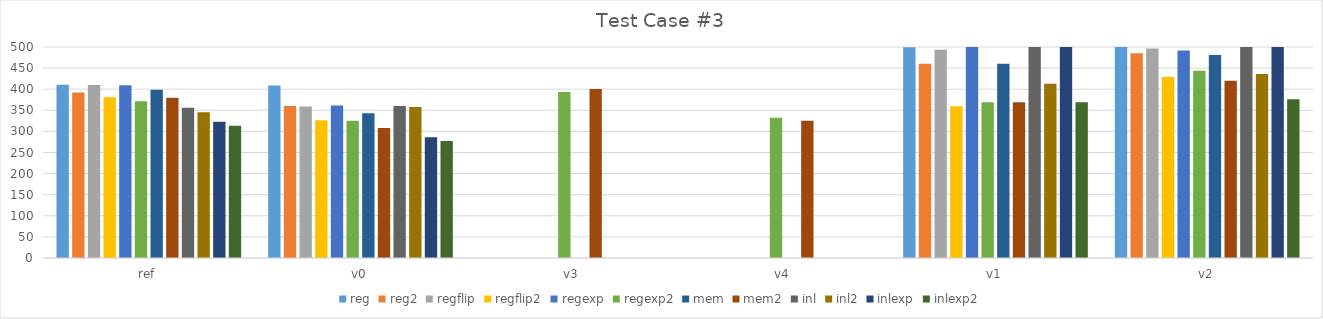
| Category | reg | reg2 | regflip | regflip2 | regexp | regexp2 | mem | mem2 | inl | inl2 | inlexp | inlexp2 |
|---|---|---|---|---|---|---|---|---|---|---|---|---|
| ref | 410.251 | 392.333 | 409.998 | 380.88 | 409.557 | 371.265 | 398.881 | 379.814 | 355.803 | 345.34 | 323.092 | 313.67 |
| v0 | 408.612 | 359.956 | 359.269 | 326.292 | 361.139 | 325.335 | 342.81 | 308.346 | 360.374 | 357.533 | 286.123 | 277.122 |
| v3 | 0 | 0 | 0 | 0 | 0 | 393.527 | 0 | 400.736 | 0 | 0 | 0 | 0 |
| v4 | 0 | 0 | 0 | 0 | 0 | 332.584 | 0 | 325.126 | 0 | 0 | 0 | 0 |
| v1 | 499.153 | 460.301 | 493.285 | 359.356 | 596.629 | 369.286 | 460.446 | 369.28 | 632.327 | 412.902 | 596.634 | 369.371 |
| v2 | 642.495 | 485.101 | 496.197 | 428.968 | 491.623 | 443.71 | 481.056 | 419.975 | 583.814 | 435.96 | 619.36 | 376.065 |